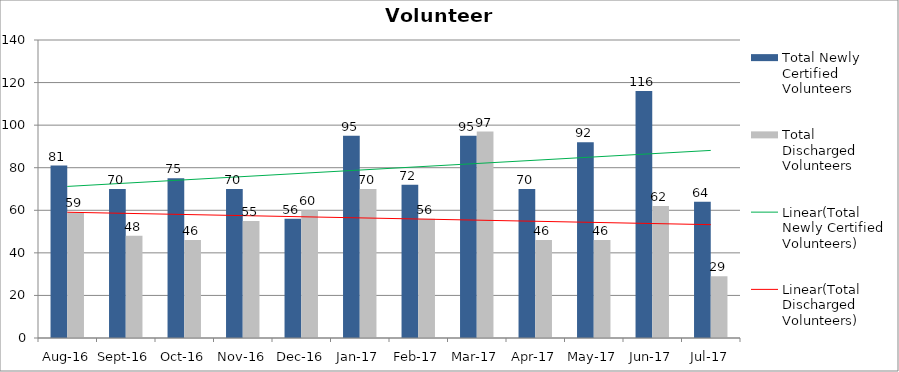
| Category | Total Newly Certified Volunteers | Total Discharged Volunteers |
|---|---|---|
| Aug-16 | 81 | 59 |
| Sep-16 | 70 | 48 |
| Oct-16 | 75 | 46 |
| Nov-16 | 70 | 55 |
| Dec-16 | 56 | 60 |
| Jan-17 | 95 | 70 |
| Feb-17 | 72 | 56 |
| Mar-17 | 95 | 97 |
| Apr-17 | 70 | 46 |
| May-17 | 92 | 46 |
| Jun-17 | 116 | 62 |
| Jul-17 | 64 | 29 |